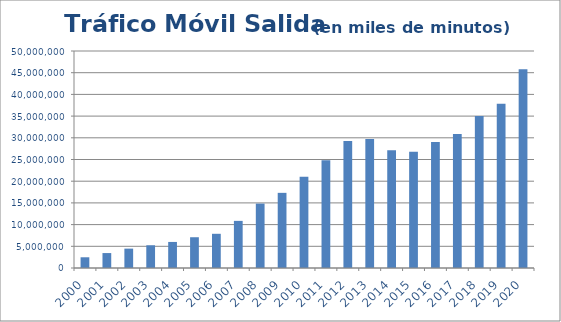
| Category | Tráfico Salida  en miles de minutos  |
|---|---|
| 2000 | 2471208.216 |
| 2001 | 3441736.145 |
| 2002 | 4464101.558 |
| 2003 | 5237945.688 |
| 2004 | 6003889.136 |
| 2005 | 7089121.671 |
| 2006 | 7881070.445 |
| 2007 | 10857829.097 |
| 2008 | 14842544.992 |
| 2009 | 17315937.37 |
| 2010 | 21012307.587 |
| 2011 | 24832335.384 |
| 2012 | 29284513.139 |
| 2013 | 29748487.795 |
| 2014 | 27120732.321 |
| 2015 | 26759882.276 |
| 2016 | 29023085.247 |
| 2017 | 30893589.798 |
| 2018 | 35010096.544 |
| 2019 | 37859939.438 |
| 2020 | 45771603.977 |